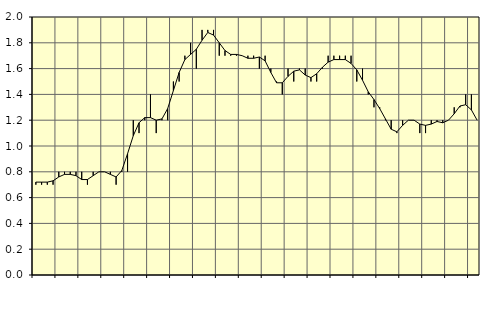
| Category | Piggar | Anställda utomlands |
|---|---|---|
| nan | 0.7 | 0.72 |
| 1.0 | 0.7 | 0.72 |
| 1.0 | 0.7 | 0.72 |
| 1.0 | 0.7 | 0.73 |
| nan | 0.8 | 0.76 |
| 2.0 | 0.8 | 0.78 |
| 2.0 | 0.8 | 0.78 |
| 2.0 | 0.8 | 0.77 |
| nan | 0.8 | 0.74 |
| 3.0 | 0.7 | 0.74 |
| 3.0 | 0.8 | 0.77 |
| 3.0 | 0.8 | 0.8 |
| nan | 0.8 | 0.8 |
| 4.0 | 0.8 | 0.78 |
| 4.0 | 0.7 | 0.76 |
| 4.0 | 0.8 | 0.81 |
| nan | 0.8 | 0.94 |
| 5.0 | 1.2 | 1.08 |
| 5.0 | 1.1 | 1.18 |
| 5.0 | 1.2 | 1.22 |
| nan | 1.4 | 1.22 |
| 6.0 | 1.1 | 1.2 |
| 6.0 | 1.2 | 1.21 |
| 6.0 | 1.2 | 1.29 |
| nan | 1.5 | 1.43 |
| 7.0 | 1.5 | 1.57 |
| 7.0 | 1.7 | 1.67 |
| 7.0 | 1.8 | 1.71 |
| nan | 1.6 | 1.75 |
| 8.0 | 1.9 | 1.82 |
| 8.0 | 1.9 | 1.88 |
| 8.0 | 1.9 | 1.86 |
| nan | 1.7 | 1.8 |
| 9.0 | 1.7 | 1.74 |
| 9.0 | 1.7 | 1.71 |
| 9.0 | 1.7 | 1.71 |
| nan | 1.7 | 1.7 |
| 10.0 | 1.7 | 1.68 |
| 10.0 | 1.7 | 1.68 |
| 10.0 | 1.6 | 1.69 |
| nan | 1.7 | 1.66 |
| 11.0 | 1.6 | 1.57 |
| 11.0 | 1.5 | 1.49 |
| 11.0 | 1.4 | 1.49 |
| nan | 1.6 | 1.54 |
| 12.0 | 1.5 | 1.58 |
| 12.0 | 1.6 | 1.59 |
| 12.0 | 1.6 | 1.55 |
| nan | 1.5 | 1.53 |
| 13.0 | 1.5 | 1.56 |
| 13.0 | 1.6 | 1.61 |
| 13.0 | 1.7 | 1.65 |
| nan | 1.7 | 1.67 |
| 14.0 | 1.7 | 1.67 |
| 14.0 | 1.7 | 1.67 |
| 14.0 | 1.7 | 1.64 |
| nan | 1.5 | 1.59 |
| 15.0 | 1.6 | 1.51 |
| 15.0 | 1.4 | 1.42 |
| 15.0 | 1.3 | 1.36 |
| nan | 1.3 | 1.29 |
| 16.0 | 1.2 | 1.21 |
| 16.0 | 1.2 | 1.13 |
| 16.0 | 1.1 | 1.11 |
| nan | 1.2 | 1.16 |
| 17.0 | 1.2 | 1.2 |
| 17.0 | 1.2 | 1.2 |
| 17.0 | 1.1 | 1.17 |
| nan | 1.1 | 1.16 |
| 18.0 | 1.2 | 1.17 |
| 18.0 | 1.2 | 1.19 |
| 18.0 | 1.2 | 1.18 |
| nan | 1.2 | 1.2 |
| 19.0 | 1.3 | 1.25 |
| 19.0 | 1.3 | 1.31 |
| 19.0 | 1.4 | 1.32 |
| nan | 1.4 | 1.28 |
| 20.0 | 1.2 | 1.2 |